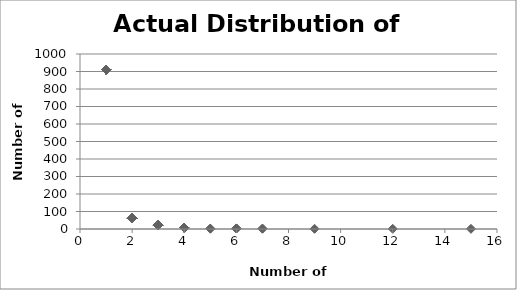
| Category | Actual Number of Athletes |
|---|---|
| 15.0 | 1 |
| 12.0 | 1 |
| 9.0 | 1 |
| 7.0 | 2 |
| 7.0 | 2 |
| 6.0 | 3 |
| 6.0 | 3 |
| 6.0 | 3 |
| 5.0 | 2 |
| 5.0 | 2 |
| 4.0 | 7 |
| 4.0 | 7 |
| 4.0 | 7 |
| 4.0 | 7 |
| 4.0 | 7 |
| 4.0 | 7 |
| 4.0 | 7 |
| 3.0 | 22 |
| 3.0 | 22 |
| 3.0 | 22 |
| 3.0 | 22 |
| 3.0 | 22 |
| 3.0 | 22 |
| 3.0 | 22 |
| 3.0 | 22 |
| 3.0 | 22 |
| 3.0 | 22 |
| 3.0 | 22 |
| 3.0 | 22 |
| 3.0 | 22 |
| 3.0 | 22 |
| 3.0 | 22 |
| 3.0 | 22 |
| 3.0 | 22 |
| 3.0 | 22 |
| 3.0 | 22 |
| 3.0 | 22 |
| 3.0 | 22 |
| 3.0 | 22 |
| 2.0 | 61 |
| 2.0 | 61 |
| 2.0 | 61 |
| 2.0 | 61 |
| 2.0 | 61 |
| 2.0 | 61 |
| 2.0 | 61 |
| 2.0 | 61 |
| 2.0 | 61 |
| 2.0 | 61 |
| 2.0 | 61 |
| 2.0 | 61 |
| 2.0 | 61 |
| 2.0 | 61 |
| 2.0 | 61 |
| 2.0 | 61 |
| 2.0 | 61 |
| 2.0 | 61 |
| 2.0 | 61 |
| 2.0 | 61 |
| 2.0 | 61 |
| 2.0 | 61 |
| 2.0 | 61 |
| 2.0 | 61 |
| 2.0 | 61 |
| 2.0 | 61 |
| 2.0 | 61 |
| 2.0 | 61 |
| 2.0 | 61 |
| 2.0 | 61 |
| 2.0 | 61 |
| 2.0 | 61 |
| 2.0 | 61 |
| 2.0 | 61 |
| 2.0 | 61 |
| 2.0 | 61 |
| 2.0 | 61 |
| 2.0 | 61 |
| 2.0 | 61 |
| 2.0 | 61 |
| 2.0 | 61 |
| 2.0 | 61 |
| 2.0 | 61 |
| 2.0 | 61 |
| 2.0 | 61 |
| 2.0 | 61 |
| 2.0 | 61 |
| 2.0 | 61 |
| 2.0 | 61 |
| 2.0 | 61 |
| 2.0 | 61 |
| 2.0 | 61 |
| 2.0 | 61 |
| 2.0 | 61 |
| 2.0 | 61 |
| 2.0 | 61 |
| 2.0 | 61 |
| 2.0 | 61 |
| 2.0 | 61 |
| 2.0 | 61 |
| 2.0 | 61 |
| 1.0 | 911 |
| 1.0 | 911 |
| 1.0 | 911 |
| 1.0 | 911 |
| 1.0 | 911 |
| 1.0 | 911 |
| 1.0 | 911 |
| 1.0 | 911 |
| 1.0 | 911 |
| 1.0 | 911 |
| 1.0 | 911 |
| 1.0 | 911 |
| 1.0 | 911 |
| 1.0 | 911 |
| 1.0 | 911 |
| 1.0 | 911 |
| 1.0 | 911 |
| 1.0 | 911 |
| 1.0 | 911 |
| 1.0 | 911 |
| 1.0 | 911 |
| 1.0 | 911 |
| 1.0 | 911 |
| 1.0 | 911 |
| 1.0 | 911 |
| 1.0 | 911 |
| 1.0 | 911 |
| 1.0 | 911 |
| 1.0 | 911 |
| 1.0 | 911 |
| 1.0 | 911 |
| 1.0 | 911 |
| 1.0 | 911 |
| 1.0 | 911 |
| 1.0 | 911 |
| 1.0 | 911 |
| 1.0 | 911 |
| 1.0 | 911 |
| 1.0 | 911 |
| 1.0 | 911 |
| 1.0 | 911 |
| 1.0 | 911 |
| 1.0 | 911 |
| 1.0 | 911 |
| 1.0 | 911 |
| 1.0 | 911 |
| 1.0 | 911 |
| 1.0 | 911 |
| 1.0 | 911 |
| 1.0 | 911 |
| 1.0 | 911 |
| 1.0 | 911 |
| 1.0 | 911 |
| 1.0 | 911 |
| 1.0 | 911 |
| 1.0 | 911 |
| 1.0 | 911 |
| 1.0 | 911 |
| 1.0 | 911 |
| 1.0 | 911 |
| 1.0 | 911 |
| 1.0 | 911 |
| 1.0 | 911 |
| 1.0 | 911 |
| 1.0 | 911 |
| 1.0 | 911 |
| 1.0 | 911 |
| 1.0 | 911 |
| 1.0 | 911 |
| 1.0 | 911 |
| 1.0 | 911 |
| 1.0 | 911 |
| 1.0 | 911 |
| 1.0 | 911 |
| 1.0 | 911 |
| 1.0 | 911 |
| 1.0 | 911 |
| 1.0 | 911 |
| 1.0 | 911 |
| 1.0 | 911 |
| 1.0 | 911 |
| 1.0 | 911 |
| 1.0 | 911 |
| 1.0 | 911 |
| 1.0 | 911 |
| 1.0 | 911 |
| 1.0 | 911 |
| 1.0 | 911 |
| 1.0 | 911 |
| 1.0 | 911 |
| 1.0 | 911 |
| 1.0 | 911 |
| 1.0 | 911 |
| 1.0 | 911 |
| 1.0 | 911 |
| 1.0 | 911 |
| 1.0 | 911 |
| 1.0 | 911 |
| 1.0 | 911 |
| 1.0 | 911 |
| 1.0 | 911 |
| 1.0 | 911 |
| 1.0 | 911 |
| 1.0 | 911 |
| 1.0 | 911 |
| 1.0 | 911 |
| 1.0 | 911 |
| 1.0 | 911 |
| 1.0 | 911 |
| 1.0 | 911 |
| 1.0 | 911 |
| 1.0 | 911 |
| 1.0 | 911 |
| 1.0 | 911 |
| 1.0 | 911 |
| 1.0 | 911 |
| 1.0 | 911 |
| 1.0 | 911 |
| 1.0 | 911 |
| 1.0 | 911 |
| 1.0 | 911 |
| 1.0 | 911 |
| 1.0 | 911 |
| 1.0 | 911 |
| 1.0 | 911 |
| 1.0 | 911 |
| 1.0 | 911 |
| 1.0 | 911 |
| 1.0 | 911 |
| 1.0 | 911 |
| 1.0 | 911 |
| 1.0 | 911 |
| 1.0 | 911 |
| 1.0 | 911 |
| 1.0 | 911 |
| 1.0 | 911 |
| 1.0 | 911 |
| 1.0 | 911 |
| 1.0 | 911 |
| 1.0 | 911 |
| 1.0 | 911 |
| 1.0 | 911 |
| 1.0 | 911 |
| 1.0 | 911 |
| 1.0 | 911 |
| 1.0 | 911 |
| 1.0 | 911 |
| 1.0 | 911 |
| 1.0 | 911 |
| 1.0 | 911 |
| 1.0 | 911 |
| 1.0 | 911 |
| 1.0 | 911 |
| 1.0 | 911 |
| 1.0 | 911 |
| 1.0 | 911 |
| 1.0 | 911 |
| 1.0 | 911 |
| 1.0 | 911 |
| 1.0 | 911 |
| 1.0 | 911 |
| 1.0 | 911 |
| 1.0 | 911 |
| 1.0 | 911 |
| 1.0 | 911 |
| 1.0 | 911 |
| 1.0 | 911 |
| 1.0 | 911 |
| 1.0 | 911 |
| 1.0 | 911 |
| 1.0 | 911 |
| 1.0 | 911 |
| 1.0 | 911 |
| 1.0 | 911 |
| 1.0 | 911 |
| 1.0 | 911 |
| 1.0 | 911 |
| 1.0 | 911 |
| 1.0 | 911 |
| 1.0 | 911 |
| 1.0 | 911 |
| 1.0 | 911 |
| 1.0 | 911 |
| 1.0 | 911 |
| 1.0 | 911 |
| 1.0 | 911 |
| 1.0 | 911 |
| 1.0 | 911 |
| 1.0 | 911 |
| 1.0 | 911 |
| 1.0 | 911 |
| 1.0 | 911 |
| 1.0 | 911 |
| 1.0 | 911 |
| 1.0 | 911 |
| 1.0 | 911 |
| 1.0 | 911 |
| 1.0 | 911 |
| 1.0 | 911 |
| 1.0 | 911 |
| 1.0 | 911 |
| 1.0 | 911 |
| 1.0 | 911 |
| 1.0 | 911 |
| 1.0 | 911 |
| 1.0 | 911 |
| 1.0 | 911 |
| 1.0 | 911 |
| 1.0 | 911 |
| 1.0 | 911 |
| 1.0 | 911 |
| 1.0 | 911 |
| 1.0 | 911 |
| 1.0 | 911 |
| 1.0 | 911 |
| 1.0 | 911 |
| 1.0 | 911 |
| 1.0 | 911 |
| 1.0 | 911 |
| 1.0 | 911 |
| 1.0 | 911 |
| 1.0 | 911 |
| 1.0 | 911 |
| 1.0 | 911 |
| 1.0 | 911 |
| 1.0 | 911 |
| 1.0 | 911 |
| 1.0 | 911 |
| 1.0 | 911 |
| 1.0 | 911 |
| 1.0 | 911 |
| 1.0 | 911 |
| 1.0 | 911 |
| 1.0 | 911 |
| 1.0 | 911 |
| 1.0 | 911 |
| 1.0 | 911 |
| 1.0 | 911 |
| 1.0 | 911 |
| 1.0 | 911 |
| 1.0 | 911 |
| 1.0 | 911 |
| 1.0 | 911 |
| 1.0 | 911 |
| 1.0 | 911 |
| 1.0 | 911 |
| 1.0 | 911 |
| 1.0 | 911 |
| 1.0 | 911 |
| 1.0 | 911 |
| 1.0 | 911 |
| 1.0 | 911 |
| 1.0 | 911 |
| 1.0 | 911 |
| 1.0 | 911 |
| 1.0 | 911 |
| 1.0 | 911 |
| 1.0 | 911 |
| 1.0 | 911 |
| 1.0 | 911 |
| 1.0 | 911 |
| 1.0 | 911 |
| 1.0 | 911 |
| 1.0 | 911 |
| 1.0 | 911 |
| 1.0 | 911 |
| 1.0 | 911 |
| 1.0 | 911 |
| 1.0 | 911 |
| 1.0 | 911 |
| 1.0 | 911 |
| 1.0 | 911 |
| 1.0 | 911 |
| 1.0 | 911 |
| 1.0 | 911 |
| 1.0 | 911 |
| 1.0 | 911 |
| 1.0 | 911 |
| 1.0 | 911 |
| 1.0 | 911 |
| 1.0 | 911 |
| 1.0 | 911 |
| 1.0 | 911 |
| 1.0 | 911 |
| 1.0 | 911 |
| 1.0 | 911 |
| 1.0 | 911 |
| 1.0 | 911 |
| 1.0 | 911 |
| 1.0 | 911 |
| 1.0 | 911 |
| 1.0 | 911 |
| 1.0 | 911 |
| 1.0 | 911 |
| 1.0 | 911 |
| 1.0 | 911 |
| 1.0 | 911 |
| 1.0 | 911 |
| 1.0 | 911 |
| 1.0 | 911 |
| 1.0 | 911 |
| 1.0 | 911 |
| 1.0 | 911 |
| 1.0 | 911 |
| 1.0 | 911 |
| 1.0 | 911 |
| 1.0 | 911 |
| 1.0 | 911 |
| 1.0 | 911 |
| 1.0 | 911 |
| 1.0 | 911 |
| 1.0 | 911 |
| 1.0 | 911 |
| 1.0 | 911 |
| 1.0 | 911 |
| 1.0 | 911 |
| 1.0 | 911 |
| 1.0 | 911 |
| 1.0 | 911 |
| 1.0 | 911 |
| 1.0 | 911 |
| 1.0 | 911 |
| 1.0 | 911 |
| 1.0 | 911 |
| 1.0 | 911 |
| 1.0 | 911 |
| 1.0 | 911 |
| 1.0 | 911 |
| 1.0 | 911 |
| 1.0 | 911 |
| 1.0 | 911 |
| 1.0 | 911 |
| 1.0 | 911 |
| 1.0 | 911 |
| 1.0 | 911 |
| 1.0 | 911 |
| 1.0 | 911 |
| 1.0 | 911 |
| 1.0 | 911 |
| 1.0 | 911 |
| 1.0 | 911 |
| 1.0 | 911 |
| 1.0 | 911 |
| 1.0 | 911 |
| 1.0 | 911 |
| 1.0 | 911 |
| 1.0 | 911 |
| 1.0 | 911 |
| 1.0 | 911 |
| 1.0 | 911 |
| 1.0 | 911 |
| 1.0 | 911 |
| 1.0 | 911 |
| 1.0 | 911 |
| 1.0 | 911 |
| 1.0 | 911 |
| 1.0 | 911 |
| 1.0 | 911 |
| 1.0 | 911 |
| 1.0 | 911 |
| 1.0 | 911 |
| 1.0 | 911 |
| 1.0 | 911 |
| 1.0 | 911 |
| 1.0 | 911 |
| 1.0 | 911 |
| 1.0 | 911 |
| 1.0 | 911 |
| 1.0 | 911 |
| 1.0 | 911 |
| 1.0 | 911 |
| 1.0 | 911 |
| 1.0 | 911 |
| 1.0 | 911 |
| 1.0 | 911 |
| 1.0 | 911 |
| 1.0 | 911 |
| 1.0 | 911 |
| 1.0 | 911 |
| 1.0 | 911 |
| 1.0 | 911 |
| 1.0 | 911 |
| 1.0 | 911 |
| 1.0 | 911 |
| 1.0 | 911 |
| 1.0 | 911 |
| 1.0 | 911 |
| 1.0 | 911 |
| 1.0 | 911 |
| 1.0 | 911 |
| 1.0 | 911 |
| 1.0 | 911 |
| 1.0 | 911 |
| 1.0 | 911 |
| 1.0 | 911 |
| 1.0 | 911 |
| 1.0 | 911 |
| 1.0 | 911 |
| 1.0 | 911 |
| 1.0 | 911 |
| 1.0 | 911 |
| 1.0 | 911 |
| 1.0 | 911 |
| 1.0 | 911 |
| 1.0 | 911 |
| 1.0 | 911 |
| 1.0 | 911 |
| 1.0 | 911 |
| 1.0 | 911 |
| 1.0 | 911 |
| 1.0 | 911 |
| 1.0 | 911 |
| 1.0 | 911 |
| 1.0 | 911 |
| 1.0 | 911 |
| 1.0 | 911 |
| 1.0 | 911 |
| 1.0 | 911 |
| 1.0 | 911 |
| 1.0 | 911 |
| 1.0 | 911 |
| 1.0 | 911 |
| 1.0 | 911 |
| 1.0 | 911 |
| 1.0 | 911 |
| 1.0 | 911 |
| 1.0 | 911 |
| 1.0 | 911 |
| 1.0 | 911 |
| 1.0 | 911 |
| 1.0 | 911 |
| 1.0 | 911 |
| 1.0 | 911 |
| 1.0 | 911 |
| 1.0 | 911 |
| 1.0 | 911 |
| 1.0 | 911 |
| 1.0 | 911 |
| 1.0 | 911 |
| 1.0 | 911 |
| 1.0 | 911 |
| 1.0 | 911 |
| 1.0 | 911 |
| 1.0 | 911 |
| 1.0 | 911 |
| 1.0 | 911 |
| 1.0 | 911 |
| 1.0 | 911 |
| 1.0 | 911 |
| 1.0 | 911 |
| 1.0 | 911 |
| 1.0 | 911 |
| 1.0 | 911 |
| 1.0 | 911 |
| 1.0 | 911 |
| 1.0 | 911 |
| 1.0 | 911 |
| 1.0 | 911 |
| 1.0 | 911 |
| 1.0 | 911 |
| 1.0 | 911 |
| 1.0 | 911 |
| 1.0 | 911 |
| 1.0 | 911 |
| 1.0 | 911 |
| 1.0 | 911 |
| 1.0 | 911 |
| 1.0 | 911 |
| 1.0 | 911 |
| 1.0 | 911 |
| 1.0 | 911 |
| 1.0 | 911 |
| 1.0 | 911 |
| 1.0 | 911 |
| 1.0 | 911 |
| 1.0 | 911 |
| 1.0 | 911 |
| 1.0 | 911 |
| 1.0 | 911 |
| 1.0 | 911 |
| 1.0 | 911 |
| 1.0 | 911 |
| 1.0 | 911 |
| 1.0 | 911 |
| 1.0 | 911 |
| 1.0 | 911 |
| 1.0 | 911 |
| 1.0 | 911 |
| 1.0 | 911 |
| 1.0 | 911 |
| 1.0 | 911 |
| 1.0 | 911 |
| 1.0 | 911 |
| 1.0 | 911 |
| 1.0 | 911 |
| 1.0 | 911 |
| 1.0 | 911 |
| 1.0 | 911 |
| 1.0 | 911 |
| 1.0 | 911 |
| 1.0 | 911 |
| 1.0 | 911 |
| 1.0 | 911 |
| 1.0 | 911 |
| 1.0 | 911 |
| 1.0 | 911 |
| 1.0 | 911 |
| 1.0 | 911 |
| 1.0 | 911 |
| 1.0 | 911 |
| 1.0 | 911 |
| 1.0 | 911 |
| 1.0 | 911 |
| 1.0 | 911 |
| 1.0 | 911 |
| 1.0 | 911 |
| 1.0 | 911 |
| 1.0 | 911 |
| 1.0 | 911 |
| 1.0 | 911 |
| 1.0 | 911 |
| 1.0 | 911 |
| 1.0 | 911 |
| 1.0 | 911 |
| 1.0 | 911 |
| 1.0 | 911 |
| 1.0 | 911 |
| 1.0 | 911 |
| 1.0 | 911 |
| 1.0 | 911 |
| 1.0 | 911 |
| 1.0 | 911 |
| 1.0 | 911 |
| 1.0 | 911 |
| 1.0 | 911 |
| 1.0 | 911 |
| 1.0 | 911 |
| 1.0 | 911 |
| 1.0 | 911 |
| 1.0 | 911 |
| 1.0 | 911 |
| 1.0 | 911 |
| 1.0 | 911 |
| 1.0 | 911 |
| 1.0 | 911 |
| 1.0 | 911 |
| 1.0 | 911 |
| 1.0 | 911 |
| 1.0 | 911 |
| 1.0 | 911 |
| 1.0 | 911 |
| 1.0 | 911 |
| 1.0 | 911 |
| 1.0 | 911 |
| 1.0 | 911 |
| 1.0 | 911 |
| 1.0 | 911 |
| 1.0 | 911 |
| 1.0 | 911 |
| 1.0 | 911 |
| 1.0 | 911 |
| 1.0 | 911 |
| 1.0 | 911 |
| 1.0 | 911 |
| 1.0 | 911 |
| 1.0 | 911 |
| 1.0 | 911 |
| 1.0 | 911 |
| 1.0 | 911 |
| 1.0 | 911 |
| 1.0 | 911 |
| 1.0 | 911 |
| 1.0 | 911 |
| 1.0 | 911 |
| 1.0 | 911 |
| 1.0 | 911 |
| 1.0 | 911 |
| 1.0 | 911 |
| 1.0 | 911 |
| 1.0 | 911 |
| 1.0 | 911 |
| 1.0 | 911 |
| 1.0 | 911 |
| 1.0 | 911 |
| 1.0 | 911 |
| 1.0 | 911 |
| 1.0 | 911 |
| 1.0 | 911 |
| 1.0 | 911 |
| 1.0 | 911 |
| 1.0 | 911 |
| 1.0 | 911 |
| 1.0 | 911 |
| 1.0 | 911 |
| 1.0 | 911 |
| 1.0 | 911 |
| 1.0 | 911 |
| 1.0 | 911 |
| 1.0 | 911 |
| 1.0 | 911 |
| 1.0 | 911 |
| 1.0 | 911 |
| 1.0 | 911 |
| 1.0 | 911 |
| 1.0 | 911 |
| 1.0 | 911 |
| 1.0 | 911 |
| 1.0 | 911 |
| 1.0 | 911 |
| 1.0 | 911 |
| 1.0 | 911 |
| 1.0 | 911 |
| 1.0 | 911 |
| 1.0 | 911 |
| 1.0 | 911 |
| 1.0 | 911 |
| 1.0 | 911 |
| 1.0 | 911 |
| 1.0 | 911 |
| 1.0 | 911 |
| 1.0 | 911 |
| 1.0 | 911 |
| 1.0 | 911 |
| 1.0 | 911 |
| 1.0 | 911 |
| 1.0 | 911 |
| 1.0 | 911 |
| 1.0 | 911 |
| 1.0 | 911 |
| 1.0 | 911 |
| 1.0 | 911 |
| 1.0 | 911 |
| 1.0 | 911 |
| 1.0 | 911 |
| 1.0 | 911 |
| 1.0 | 911 |
| 1.0 | 911 |
| 1.0 | 911 |
| 1.0 | 911 |
| 1.0 | 911 |
| 1.0 | 911 |
| 1.0 | 911 |
| 1.0 | 911 |
| 1.0 | 911 |
| 1.0 | 911 |
| 1.0 | 911 |
| 1.0 | 911 |
| 1.0 | 911 |
| 1.0 | 911 |
| 1.0 | 911 |
| 1.0 | 911 |
| 1.0 | 911 |
| 1.0 | 911 |
| 1.0 | 911 |
| 1.0 | 911 |
| 1.0 | 911 |
| 1.0 | 911 |
| 1.0 | 911 |
| 1.0 | 911 |
| 1.0 | 911 |
| 1.0 | 911 |
| 1.0 | 911 |
| 1.0 | 911 |
| 1.0 | 911 |
| 1.0 | 911 |
| 1.0 | 911 |
| 1.0 | 911 |
| 1.0 | 911 |
| 1.0 | 911 |
| 1.0 | 911 |
| 1.0 | 911 |
| 1.0 | 911 |
| 1.0 | 911 |
| 1.0 | 911 |
| 1.0 | 911 |
| 1.0 | 911 |
| 1.0 | 911 |
| 1.0 | 911 |
| 1.0 | 911 |
| 1.0 | 911 |
| 1.0 | 911 |
| 1.0 | 911 |
| 1.0 | 911 |
| 1.0 | 911 |
| 1.0 | 911 |
| 1.0 | 911 |
| 1.0 | 911 |
| 1.0 | 911 |
| 1.0 | 911 |
| 1.0 | 911 |
| 1.0 | 911 |
| 1.0 | 911 |
| 1.0 | 911 |
| 1.0 | 911 |
| 1.0 | 911 |
| 1.0 | 911 |
| 1.0 | 911 |
| 1.0 | 911 |
| 1.0 | 911 |
| 1.0 | 911 |
| 1.0 | 911 |
| 1.0 | 911 |
| 1.0 | 911 |
| 1.0 | 911 |
| 1.0 | 911 |
| 1.0 | 911 |
| 1.0 | 911 |
| 1.0 | 911 |
| 1.0 | 911 |
| 1.0 | 911 |
| 1.0 | 911 |
| 1.0 | 911 |
| 1.0 | 911 |
| 1.0 | 911 |
| 1.0 | 911 |
| 1.0 | 911 |
| 1.0 | 911 |
| 1.0 | 911 |
| 1.0 | 911 |
| 1.0 | 911 |
| 1.0 | 911 |
| 1.0 | 911 |
| 1.0 | 911 |
| 1.0 | 911 |
| 1.0 | 911 |
| 1.0 | 911 |
| 1.0 | 911 |
| 1.0 | 911 |
| 1.0 | 911 |
| 1.0 | 911 |
| 1.0 | 911 |
| 1.0 | 911 |
| 1.0 | 911 |
| 1.0 | 911 |
| 1.0 | 911 |
| 1.0 | 911 |
| 1.0 | 911 |
| 1.0 | 911 |
| 1.0 | 911 |
| 1.0 | 911 |
| 1.0 | 911 |
| 1.0 | 911 |
| 1.0 | 911 |
| 1.0 | 911 |
| 1.0 | 911 |
| 1.0 | 911 |
| 1.0 | 911 |
| 1.0 | 911 |
| 1.0 | 911 |
| 1.0 | 911 |
| 1.0 | 911 |
| 1.0 | 911 |
| 1.0 | 911 |
| 1.0 | 911 |
| 1.0 | 911 |
| 1.0 | 911 |
| 1.0 | 911 |
| 1.0 | 911 |
| 1.0 | 911 |
| 1.0 | 911 |
| 1.0 | 911 |
| 1.0 | 911 |
| 1.0 | 911 |
| 1.0 | 911 |
| 1.0 | 911 |
| 1.0 | 911 |
| 1.0 | 911 |
| 1.0 | 911 |
| 1.0 | 911 |
| 1.0 | 911 |
| 1.0 | 911 |
| 1.0 | 911 |
| 1.0 | 911 |
| 1.0 | 911 |
| 1.0 | 911 |
| 1.0 | 911 |
| 1.0 | 911 |
| 1.0 | 911 |
| 1.0 | 911 |
| 1.0 | 911 |
| 1.0 | 911 |
| 1.0 | 911 |
| 1.0 | 911 |
| 1.0 | 911 |
| 1.0 | 911 |
| 1.0 | 911 |
| 1.0 | 911 |
| 1.0 | 911 |
| 1.0 | 911 |
| 1.0 | 911 |
| 1.0 | 911 |
| 1.0 | 911 |
| 1.0 | 911 |
| 1.0 | 911 |
| 1.0 | 911 |
| 1.0 | 911 |
| 1.0 | 911 |
| 1.0 | 911 |
| 1.0 | 911 |
| 1.0 | 911 |
| 1.0 | 911 |
| 1.0 | 911 |
| 1.0 | 911 |
| 1.0 | 911 |
| 1.0 | 911 |
| 1.0 | 911 |
| 1.0 | 911 |
| 1.0 | 911 |
| 1.0 | 911 |
| 1.0 | 911 |
| 1.0 | 911 |
| 1.0 | 911 |
| 1.0 | 911 |
| 1.0 | 911 |
| 1.0 | 911 |
| 1.0 | 911 |
| 1.0 | 911 |
| 1.0 | 911 |
| 1.0 | 911 |
| 1.0 | 911 |
| 1.0 | 911 |
| 1.0 | 911 |
| 1.0 | 911 |
| 1.0 | 911 |
| 1.0 | 911 |
| 1.0 | 911 |
| 1.0 | 911 |
| 1.0 | 911 |
| 1.0 | 911 |
| 1.0 | 911 |
| 1.0 | 911 |
| 1.0 | 911 |
| 1.0 | 911 |
| 1.0 | 911 |
| 1.0 | 911 |
| 1.0 | 911 |
| 1.0 | 911 |
| 1.0 | 911 |
| 1.0 | 911 |
| 1.0 | 911 |
| 1.0 | 911 |
| 1.0 | 911 |
| 1.0 | 911 |
| 1.0 | 911 |
| 1.0 | 911 |
| 1.0 | 911 |
| 1.0 | 911 |
| 1.0 | 911 |
| 1.0 | 911 |
| 1.0 | 911 |
| 1.0 | 911 |
| 1.0 | 911 |
| 1.0 | 911 |
| 1.0 | 911 |
| 1.0 | 911 |
| 1.0 | 911 |
| 1.0 | 911 |
| 1.0 | 911 |
| 1.0 | 911 |
| 1.0 | 911 |
| 1.0 | 911 |
| 1.0 | 911 |
| 1.0 | 911 |
| 1.0 | 911 |
| 1.0 | 911 |
| 1.0 | 911 |
| 1.0 | 911 |
| 1.0 | 911 |
| 1.0 | 911 |
| 1.0 | 911 |
| 1.0 | 911 |
| 1.0 | 911 |
| 1.0 | 911 |
| 1.0 | 911 |
| 1.0 | 911 |
| 1.0 | 911 |
| 1.0 | 911 |
| 1.0 | 911 |
| 1.0 | 911 |
| 1.0 | 911 |
| 1.0 | 911 |
| 1.0 | 911 |
| 1.0 | 911 |
| 1.0 | 911 |
| 1.0 | 911 |
| 1.0 | 911 |
| 1.0 | 911 |
| 1.0 | 911 |
| 1.0 | 911 |
| 1.0 | 911 |
| 1.0 | 911 |
| 1.0 | 911 |
| 1.0 | 911 |
| 1.0 | 911 |
| 1.0 | 911 |
| 1.0 | 911 |
| 1.0 | 911 |
| 1.0 | 911 |
| 1.0 | 911 |
| 1.0 | 911 |
| 1.0 | 911 |
| 1.0 | 911 |
| 1.0 | 911 |
| 1.0 | 911 |
| 1.0 | 911 |
| 1.0 | 911 |
| 1.0 | 911 |
| 1.0 | 911 |
| 1.0 | 911 |
| 1.0 | 911 |
| 1.0 | 911 |